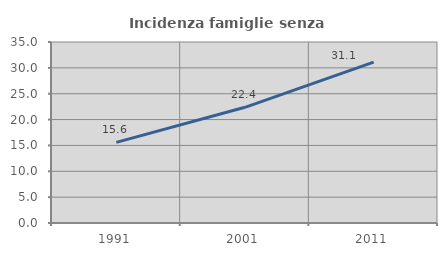
| Category | Incidenza famiglie senza nuclei |
|---|---|
| 1991.0 | 15.598 |
| 2001.0 | 22.371 |
| 2011.0 | 31.118 |